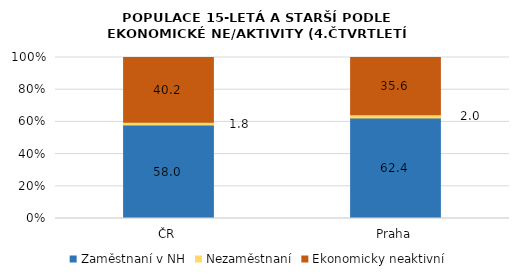
| Category | Zaměstnaní v NH | Nezaměstnaní | Ekonomicky neaktivní |
|---|---|---|---|
| ČR | 58.037 | 1.799 | 40.164 |
| Praha | 62.43 | 2.017 | 35.554 |